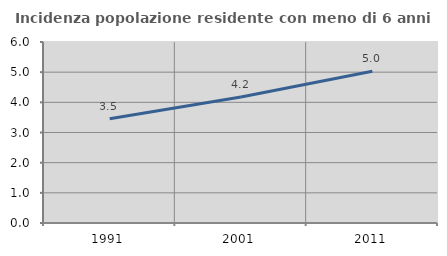
| Category | Incidenza popolazione residente con meno di 6 anni |
|---|---|
| 1991.0 | 3.453 |
| 2001.0 | 4.174 |
| 2011.0 | 5.031 |